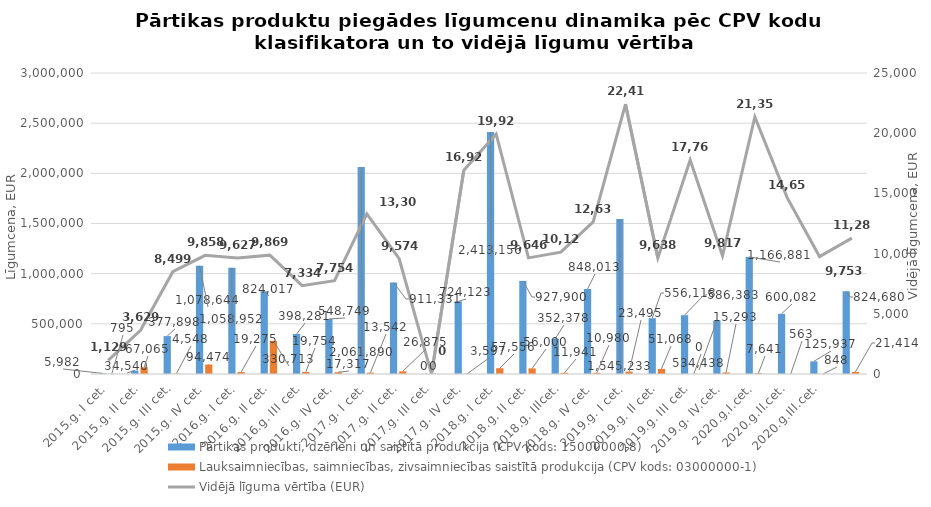
| Category | Pārtikas produkti, dzērieni un saistītā produkcija (CPV kods: 15000000-8) | Lauksaimniecības, saimniecības, zivsaimniecības saistītā produkcija (CPV kods: 03000000-1) |
|---|---|---|
| 2015.g. I cet. | 5982 | 795 |
| 2015.g. II cet. | 34540 | 67065 |
| 2015.g. III cet. | 377898 | 4548 |
| 2015.g. IV cet. | 1078644 | 94474 |
| 2016.g. I cet. | 1058952 | 19275 |
| 2016.g. II cet. | 824017 | 330713 |
| 2016.g. III cet. | 398281 | 19754 |
| 2016.g. IV cet. | 548749.01 | 17317 |
| 2017.g. I cet. | 2061890 | 13542 |
| 2017.g. II cet. | 911330.81 | 26874.91 |
| 2017.g. III cet. | 0 | 0 |
| 2017.g. IV cet. | 724123.07 | 3596.6 |
| 2018.g. I cet. | 2413156 | 57556 |
| 2018.g. II cet. | 927900 | 56000 |
| 2018.g. IIIcet. | 352378 | 11941 |
| 2018.g. IV cet. | 848013 | 10980 |
| 2019.g. I cet. | 1545233 | 23495 |
| 2019.g. II cet. | 556118 | 51068 |
| 2019.g. III cet. | 586383 | 0 |
| 2019.g. IV.cet. | 534438 | 15293 |
| 2020.g.I.cet. | 1166881 | 7641 |
| 2020.g.II.cet. | 600082 | 563 |
| 2020.g.III.cet. | 125937 | 848 |